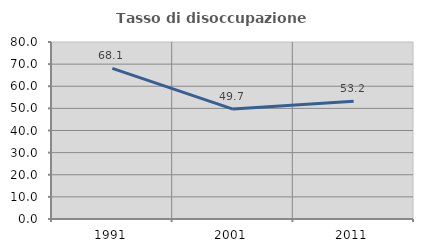
| Category | Tasso di disoccupazione giovanile  |
|---|---|
| 1991.0 | 68.11 |
| 2001.0 | 49.673 |
| 2011.0 | 53.226 |